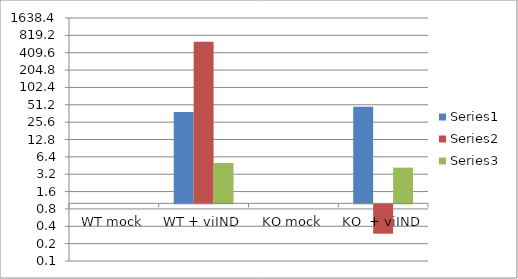
| Category | Series 0 | Series 1 | Series 2 |
|---|---|---|---|
| WT mock | 1 | 1 | 1 |
| WT + viIND | 38.556 | 632.213 | 5.023 |
| KO mock | 1 | 1 | 1 |
| KO  + viIND | 47.432 | 0.31 | 4.164 |